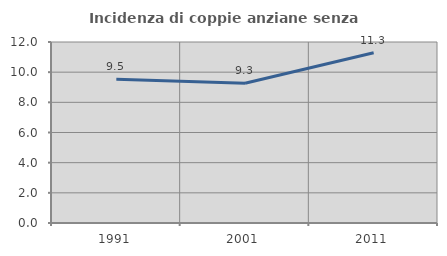
| Category | Incidenza di coppie anziane senza figli  |
|---|---|
| 1991.0 | 9.53 |
| 2001.0 | 9.266 |
| 2011.0 | 11.292 |